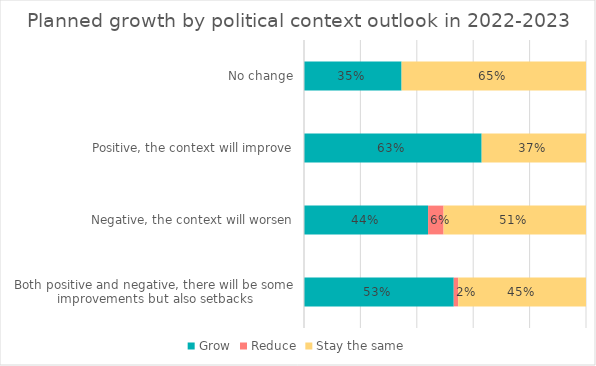
| Category | Grow | Reduce | Stay the same |
|---|---|---|---|
| No change | 34.6 | 0 | 65.4 |
| Positive, the context will improve | 63 | 0 | 37 |
| Negative, the context will worsen | 44 | 5.5 | 50.5 |
| Both positive and negative, there will be some improvements but also setbacks | 53.1 | 1.6 | 45.3 |